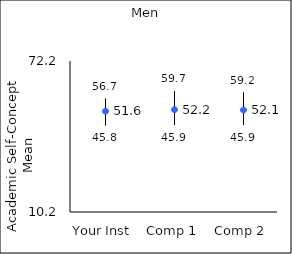
| Category | 25th percentile | 75th percentile | Mean |
|---|---|---|---|
| Your Inst | 45.8 | 56.7 | 51.57 |
| Comp 1 | 45.9 | 59.7 | 52.21 |
| Comp 2 | 45.9 | 59.2 | 52.06 |